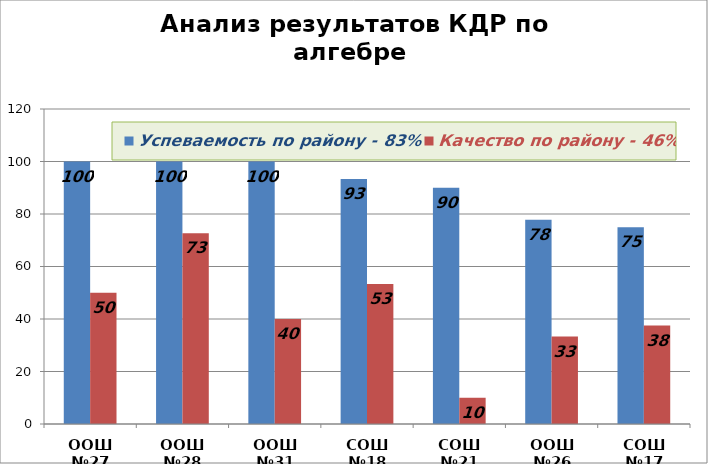
| Category | Успеваемость по району - 83% | Качество по району - 46% |
|---|---|---|
| ООШ №27 | 100 | 50 |
| ООШ №28 | 100 | 72.7 |
| ООШ №31 | 100 | 40 |
| СОШ №18 | 93.3 | 53.3 |
| СОШ №21 | 90 | 10 |
| ООШ №26 | 77.8 | 33.3 |
| СОШ №17 | 75 | 37.5 |